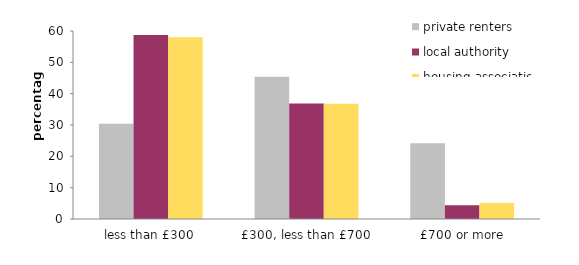
| Category | private renters | local authority | housing association |
|---|---|---|---|
| less than £300 | 30.4 | 58.7 | 58 |
| £300, less than £700 | 45.4 | 36.9 | 36.8 |
| £700 or more | 24.2 | 4.4 | 5.1 |